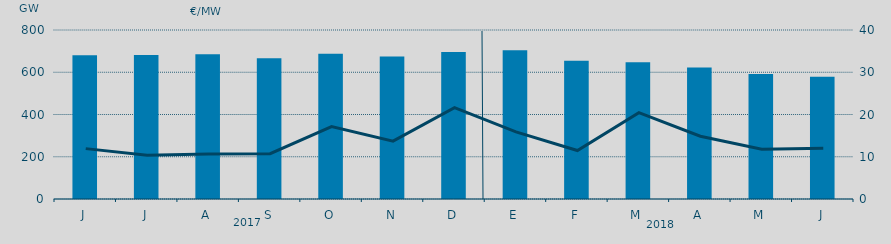
| Category | Energia (MWh) a subir |
|---|---|
| J | 680.754 |
| J | 681.722 |
| A | 685.083 |
| S | 666.501 |
| O | 686.996 |
| N | 674.335 |
| D | 695.754 |
| E | 703.828 |
| F | 654.951 |
| M | 647.688 |
| A | 622.901 |
| M | 591.481 |
| J | 578.107 |